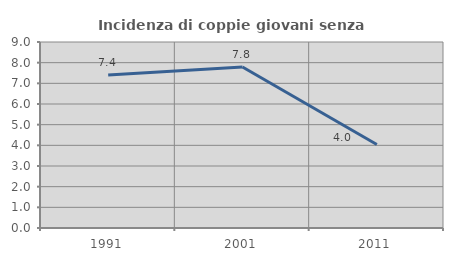
| Category | Incidenza di coppie giovani senza figli |
|---|---|
| 1991.0 | 7.407 |
| 2001.0 | 7.788 |
| 2011.0 | 4.043 |